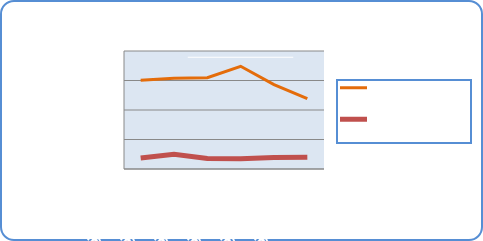
| Category | Motorin Türleri  | Benzin Türleri |
|---|---|---|
| 3/19/18 | 60160528.952 | 7442617.511 |
| 3/20/18 | 61598638.641 | 10043114.44 |
| 3/21/18 | 61887229.27 | 7060162.216 |
| 3/22/18 | 69643756.706 | 6989613.329 |
| 3/23/18 | 57171315.471 | 7834681.525 |
| 3/24/18 | 47661911.226 | 8038065.979 |